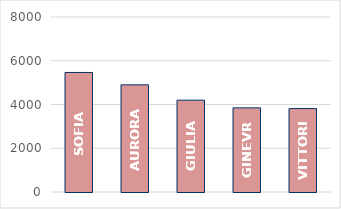
| Category | Series 0 |
|---|---|
| SOFIA | 5465 |
| AURORA | 4900 |
| GIULIA | 4198 |
| GINEVRA | 3846 |
| VITTORIA | 3814 |